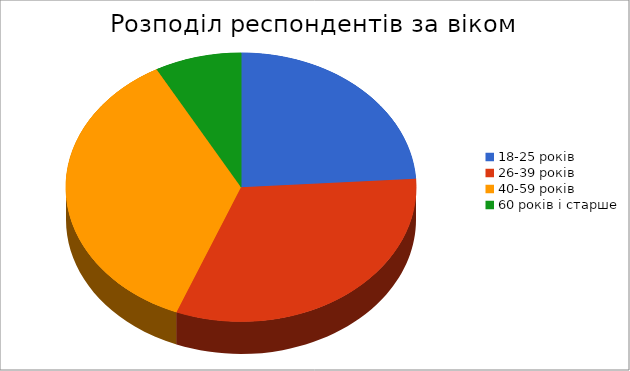
| Category | Series 0 |
|---|---|
| 18-25 років | 12 |
| 26-39 років | 16 |
| 40-59 років | 18 |
| 60 років і старше | 4 |